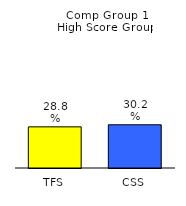
| Category | Series 0 |
|---|---|
| TFS | 0.288 |
| CSS | 0.302 |